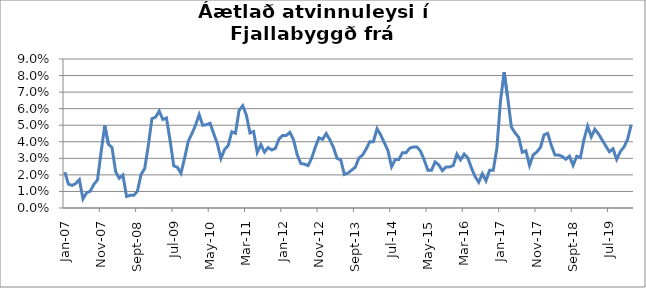
| Category | Series 0 |
|---|---|
| 2007-01-01 | 0.022 |
| 2007-02-01 | 0.014 |
| 2007-03-01 | 0.014 |
| 2007-04-01 | 0.015 |
| 2007-05-01 | 0.017 |
| 2007-06-01 | 0.005 |
| 2007-07-01 | 0.009 |
| 2007-08-01 | 0.01 |
| 2007-09-01 | 0.014 |
| 2007-10-01 | 0.017 |
| 2007-11-01 | 0.034 |
| 2007-12-01 | 0.05 |
| 2008-01-01 | 0.039 |
| 2008-02-01 | 0.036 |
| 2008-03-01 | 0.022 |
| 2008-04-01 | 0.018 |
| 2008-05-01 | 0.02 |
| 2008-06-01 | 0.007 |
| 2008-07-01 | 0.008 |
| 2008-08-01 | 0.008 |
| 2008-09-01 | 0.01 |
| 2008-10-01 | 0.02 |
| 2008-11-01 | 0.024 |
| 2008-12-01 | 0.038 |
| 2009-01-01 | 0.054 |
| 2009-02-01 | 0.055 |
| 2009-03-01 | 0.059 |
| 2009-04-01 | 0.053 |
| 2009-05-01 | 0.054 |
| 2009-06-01 | 0.041 |
| 2009-07-01 | 0.025 |
| 2009-08-01 | 0.025 |
| 2009-09-01 | 0.021 |
| 2009-10-01 | 0.03 |
| 2009-11-01 | 0.04 |
| 2009-12-01 | 0.045 |
| 2010-01-01 | 0.05 |
| 2010-02-01 | 0.056 |
| 2010-03-01 | 0.05 |
| 2010-04-01 | 0.05 |
| 2010-05-01 | 0.051 |
| 2010-06-01 | 0.045 |
| 2010-07-01 | 0.039 |
| 2010-08-01 | 0.03 |
| 2010-09-01 | 0.035 |
| 2010-10-01 | 0.038 |
| 2010-11-01 | 0.046 |
| 2010-12-01 | 0.045 |
| 2011-01-01 | 0.059 |
| 2011-02-01 | 0.062 |
| 2011-03-01 | 0.056 |
| 2011-04-01 | 0.045 |
| 2011-05-01 | 0.046 |
| 2011-06-01 | 0.034 |
| 2011-07-01 | 0.038 |
| 2011-08-01 | 0.034 |
| 2011-09-01 | 0.036 |
| 2011-10-01 | 0.035 |
| 2011-11-01 | 0.036 |
| 2011-12-01 | 0.042 |
| 2012-01-01 | 0.044 |
| 2012-02-01 | 0.044 |
| 2012-03-01 | 0.046 |
| 2012-04-01 | 0.041 |
| 2012-05-01 | 0.032 |
| 2012-06-01 | 0.027 |
| 2012-07-01 | 0.027 |
| 2012-08-01 | 0.026 |
| 2012-09-01 | 0.03 |
| 2012-10-01 | 0.037 |
| 2012-11-01 | 0.042 |
| 2012-12-01 | 0.041 |
| 2013-01-01 | 0.045 |
| 2013-02-01 | 0.041 |
| 2013-03-01 | 0.037 |
| 2013-04-01 | 0.03 |
| 2013-05-01 | 0.029 |
| 2013-06-01 | 0.02 |
| 2013-07-01 | 0.021 |
| 2013-08-01 | 0.023 |
| 2013-09-01 | 0.025 |
| 2013-10-01 | 0.03 |
| 2013-11-01 | 0.032 |
| 2013-12-01 | 0.036 |
| 2014-01-01 | 0.04 |
| 2014-02-01 | 0.04 |
| 2014-03-01 | 0.048 |
| 2014-04-01 | 0.044 |
| 2014-05-01 | 0.039 |
| 2014-06-01 | 0.035 |
| 2014-07-01 | 0.025 |
| 2014-08-01 | 0.029 |
| 2014-09-01 | 0.029 |
| 2014-10-01 | 0.033 |
| 2014-11-01 | 0.033 |
| 2014-12-01 | 0.036 |
| 2015-01-01 | 0.037 |
| 2015-02-01 | 0.037 |
| 2015-03-01 | 0.034 |
| 2015-04-01 | 0.029 |
| 2015-05-01 | 0.023 |
| 2015-06-01 | 0.023 |
| 2015-07-01 | 0.028 |
| 2015-08-01 | 0.026 |
| 2015-09-01 | 0.023 |
| 2015-10-01 | 0.025 |
| 2015-11-01 | 0.025 |
| 2015-12-01 | 0.026 |
| 2016-01-01 | 0.033 |
| 2016-02-01 | 0.029 |
| 2016-03-01 | 0.033 |
| 2016-04-01 | 0.03 |
| 2016-05-01 | 0.024 |
| 2016-06-01 | 0.019 |
| 2016-07-01 | 0.016 |
| 2016-08-01 | 0.021 |
| 2016-09-01 | 0.016 |
| 2016-10-01 | 0.023 |
| 2016-11-01 | 0.023 |
| 2016-12-01 | 0.036 |
| 2017-01-01 | 0.065 |
| 2017-02-01 | 0.082 |
| 2017-03-01 | 0.066 |
| 2017-04-01 | 0.049 |
| 2017-05-01 | 0.045 |
| 2017-06-01 | 0.043 |
| 2017-07-01 | 0.034 |
| 2017-08-01 | 0.035 |
| 2017-09-01 | 0.026 |
| 2017-10-01 | 0.032 |
| 2017-11-01 | 0.034 |
| 2017-12-01 | 0.037 |
| 2018-01-01 | 0.044 |
| 2018-02-01 | 0.045 |
| 2018-03-01 | 0.038 |
| 2018-04-01 | 0.032 |
| 2018-05-01 | 0.032 |
| 2018-06-01 | 0.031 |
| 2018-07-01 | 0.029 |
| 2018-08-01 | 0.031 |
| 2018-09-01 | 0.026 |
| 2018-10-01 | 0.031 |
| 2018-11-01 | 0.03 |
| 2018-12-01 | 0.041 |
| 2019-01-01 | 0.049 |
| 2019-02-01 | 0.043 |
| 2019-03-01 | 0.048 |
| 2019-04-01 | 0.045 |
| 2019-05-01 | 0.041 |
| 2019-06-01 | 0.037 |
| 2019-07-01 | 0.034 |
| 2019-08-01 | 0.036 |
| 2019-09-01 | 0.029 |
| 2019-10-01 | 0.034 |
| 2019-11-01 | 0.037 |
| 2019-12-01 | 0.041 |
| 2020-01-01 | 0.05 |